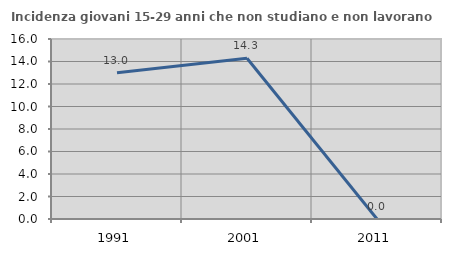
| Category | Incidenza giovani 15-29 anni che non studiano e non lavorano  |
|---|---|
| 1991.0 | 13.006 |
| 2001.0 | 14.286 |
| 2011.0 | 0 |